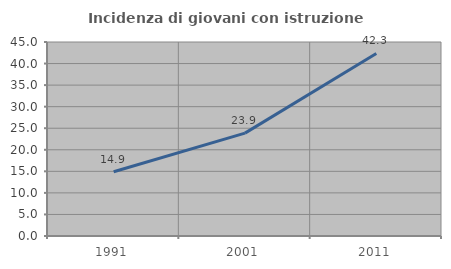
| Category | Incidenza di giovani con istruzione universitaria |
|---|---|
| 1991.0 | 14.898 |
| 2001.0 | 23.865 |
| 2011.0 | 42.348 |